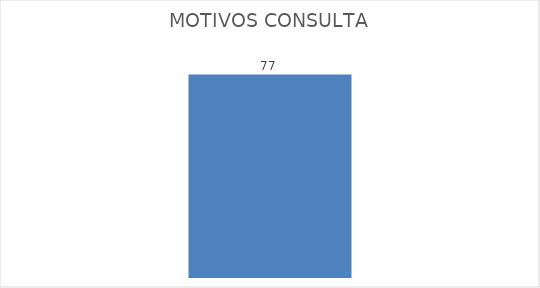
| Category | Total |
|---|---|
| Subsidios | 77 |